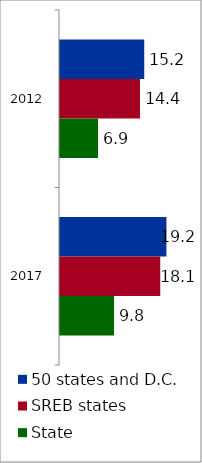
| Category | 50 states and D.C. | SREB states | State |
|---|---|---|---|
| 2012.0 | 15.2 | 14.428 | 6.854 |
| 2017.0 | 19.205 | 18.09 | 9.757 |